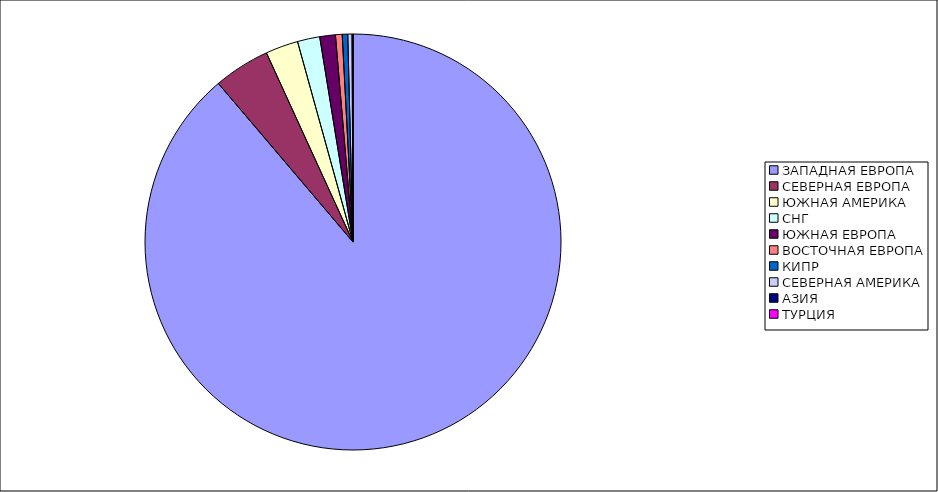
| Category | Оборот |
|---|---|
| ЗАПАДНАЯ ЕВРОПА | 0.888 |
| СЕВЕРНАЯ ЕВРОПА | 0.044 |
| ЮЖНАЯ АМЕРИКА | 0.025 |
| СНГ | 0.017 |
| ЮЖНАЯ ЕВРОПА | 0.012 |
| ВОСТОЧНАЯ ЕВРОПА | 0.005 |
| КИПР | 0.004 |
| СЕВЕРНАЯ АМЕРИКА | 0.003 |
| АЗИЯ | 0.001 |
| ТУРЦИЯ | 0 |